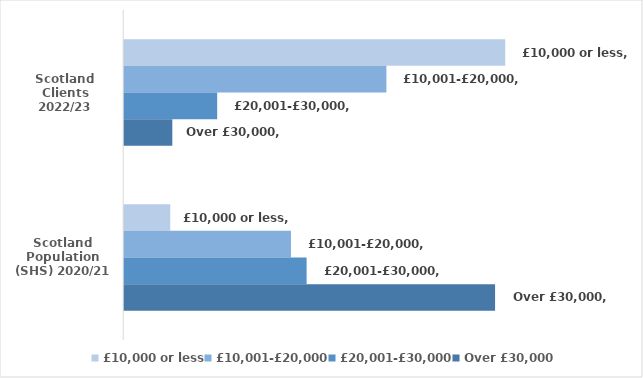
| Category | £10,000 or less | £10,001-£20,000 | £20,001-£30,000 | Over £30,000 |
|---|---|---|---|---|
| Scotland Clients 2022/23 | 0.486 | 0.334 | 0.119 | 0.061 |
| Scotland Population (SHS) 2020/21 | 0.059 | 0.213 | 0.233 | 0.473 |